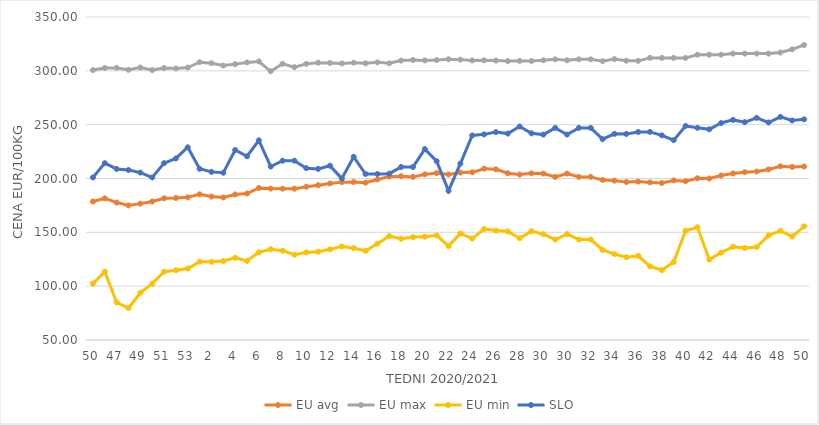
| Category | EU avg | EU max | EU min | SLO |
|---|---|---|---|---|
| 50.0 | 178.648 | 300.7 | 102.316 | 200.99 |
| 51.0 | 181.58 | 302.62 | 113.46 | 214.25 |
| 47.0 | 177.656 | 302.7 | 84.832 | 208.87 |
| 48.0 | 174.977 | 300.94 | 79.697 | 207.9 |
| 49.0 | 176.65 | 303.09 | 93.873 | 205.48 |
| 50.0 | 178.648 | 300.7 | 102.316 | 200.99 |
| 51.0 | 181.58 | 302.62 | 113.46 | 214.25 |
| 52.0 | 181.9 | 302.14 | 114.76 | 218.61 |
| 53.0 | 182.536 | 303 | 116.375 | 229 |
| 1.0 | 185.3 | 308 | 122.769 | 209 |
| 2.0 | 183.25 | 307.1 | 122.609 | 206.15 |
| 3.0 | 182.393 | 304.91 | 123.32 | 205.35 |
| 4.0 | 185.158 | 306.22 | 126.329 | 226.48 |
| 5.0 | 186.04 | 307.79 | 123.461 | 220.65 |
| 6.0 | 191.206 | 308.7 | 131.528 | 235.46 |
| 7.0 | 190.629 | 299.55 | 134.262 | 211.1 |
| 8.0 | 190.57 | 306.55 | 132.97 | 216.51 |
| 9.0 | 190.562 | 303.4 | 129.173 | 216.54 |
| 10.0 | 192.373 | 306.48 | 131.374 | 209.61 |
| 11.0 | 193.79 | 307.58 | 132.024 | 208.91 |
| 12.0 | 195.449 | 307.33 | 134.212 | 211.87 |
| 13.0 | 196.631 | 306.85 | 136.936 | 199.93 |
| 14.0 | 196.702 | 307.56 | 135.297 | 220.15 |
| 15.0 | 196.13 | 306.96 | 132.893 | 204.2 |
| 16.0 | 199.1 | 307.87 | 139.462 | 204.2 |
| 17.0 | 201.754 | 306.98 | 146.538 | 204.51 |
| 18.0 | 202.13 | 309.49 | 144.017 | 210.72 |
| 19.0 | 201.439 | 310.06 | 145.644 | 210.68 |
| 20.0 | 203.834 | 309.69 | 145.911 | 227.32 |
| 21.0 | 205.04 | 309.99 | 147.188 | 216.08 |
| 22.0 | 203.79 | 310.76 | 137.177 | 188.6 |
| 23.0 | 205.51 | 310.41 | 148.928 | 213.84 |
| 24.0 | 205.73 | 309.64 | 144.161 | 239.99 |
| 25.0 | 209.095 | 309.74 | 153.081 | 240.99 |
| 26.0 | 208.551 | 309.55 | 151.599 | 243.11 |
| 27.0 | 204.914 | 309.08 | 150.789 | 241.72 |
| 28.0 | 203.681 | 309.21 | 144.56 | 248.33 |
| 29.0 | 204.773 | 309.15 | 151.052 | 241.96 |
| 30.0 | 204.558 | 309.78 | 148.33 | 240.79 |
| 31.0 | 201.483 | 310.67 | 143.33 | 247 |
| 30.0 | 204.558 | 309.78 | 148.33 | 240.79 |
| 31.0 | 201.483 | 310.67 | 143.33 | 247 |
| 32.0 | 201.483 | 310.67 | 143.33 | 247 |
| 33.0 | 198.691 | 309 | 133.607 | 236.54 |
| 34.0 | 198.027 | 310.9 | 129.797 | 241.45 |
| 35.0 | 196.72 | 309.41 | 126.926 | 241.39 |
| 36.0 | 197.157 | 309.28 | 128.099 | 243.19 |
| 37.0 | 196.375 | 312 | 118.364 | 243.28 |
| 38.0 | 195.821 | 312 | 114.892 | 240.06 |
| 39.0 | 198.179 | 312 | 122.517 | 235.66 |
| 40.0 | 197.482 | 312 | 151.488 | 248.77 |
| 41.0 | 200.22 | 315 | 154.74 | 247.07 |
| 42.0 | 199.965 | 315 | 124.748 | 245.64 |
| 43.0 | 202.804 | 315 | 131.104 | 251.53 |
| 44.0 | 204.713 | 316 | 136.6 | 254.42 |
| 45.0 | 205.906 | 316 | 135.362 | 252.35 |
| 46.0 | 206.476 | 316 | 136.39 | 256.33 |
| 47.0 | 208.415 | 316 | 147.192 | 252.01 |
| 48.0 | 211.314 | 317 | 151.41 | 257.25 |
| 49.0 | 210.677 | 320 | 146.064 | 253.87 |
| 50.0 | 211.14 | 324 | 155.578 | 254.94 |